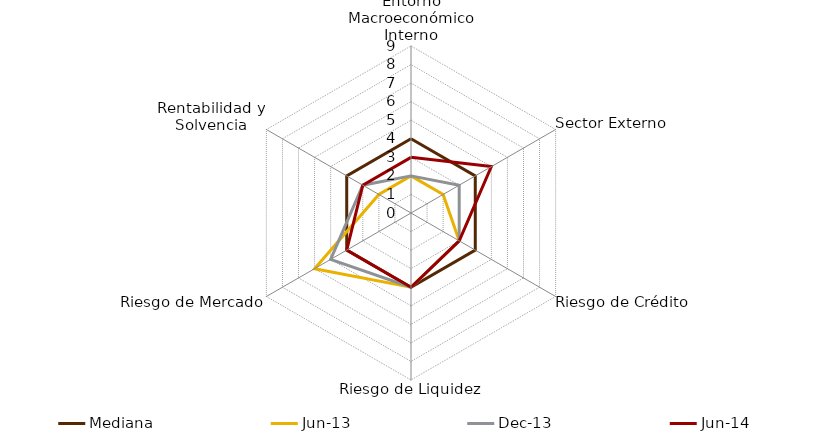
| Category | Mediana | jun-13 | dic-13 | jun-14 |
|---|---|---|---|---|
| Entorno Macroeconómico Interno | 4 | 2 | 2 | 3 |
| Sector Externo | 4 | 2 | 3 | 5 |
| Riesgo de Crédito | 4 | 3 | 3 | 3 |
| Riesgo de Liquidez | 4 | 4 | 4 | 4 |
| Riesgo de Mercado | 4 | 6 | 5 | 4 |
| Rentabilidad y Solvencia | 4 | 2 | 3 | 3 |